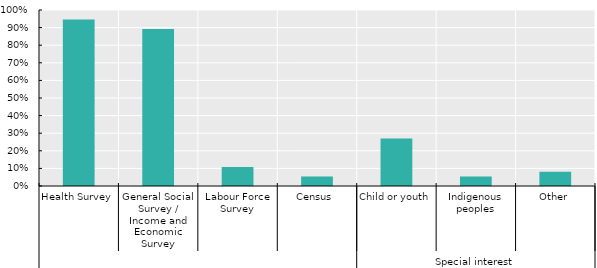
| Category | Share who answered |
|---|---|
| 0 | 0.946 |
| 1 | 0.892 |
| 2 | 0.108 |
| 3 | 0.054 |
| 4 | 0.27 |
| 5 | 0.054 |
| 6 | 0.081 |